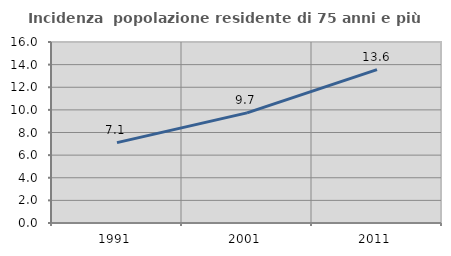
| Category | Incidenza  popolazione residente di 75 anni e più |
|---|---|
| 1991.0 | 7.106 |
| 2001.0 | 9.734 |
| 2011.0 | 13.556 |